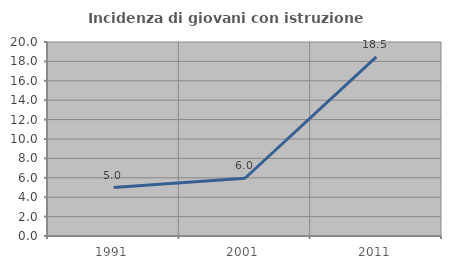
| Category | Incidenza di giovani con istruzione universitaria |
|---|---|
| 1991.0 | 5 |
| 2001.0 | 5.952 |
| 2011.0 | 18.462 |